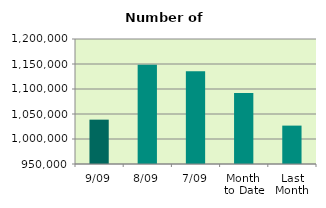
| Category | Series 0 |
|---|---|
| 9/09 | 1038692 |
| 8/09 | 1148318 |
| 7/09 | 1135558 |
| Month 
to Date | 1091778.286 |
| Last
Month | 1026775.304 |